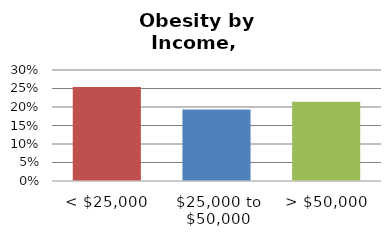
| Category | Series 0 |
|---|---|
| < $25,000 | 0.254 |
| $25,000 to $50,000 | 0.193 |
| > $50,000 | 0.214 |